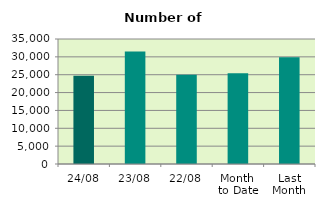
| Category | Series 0 |
|---|---|
| 24/08 | 24686 |
| 23/08 | 31484 |
| 22/08 | 24956 |
| Month 
to Date | 25386.778 |
| Last
Month | 29864.476 |